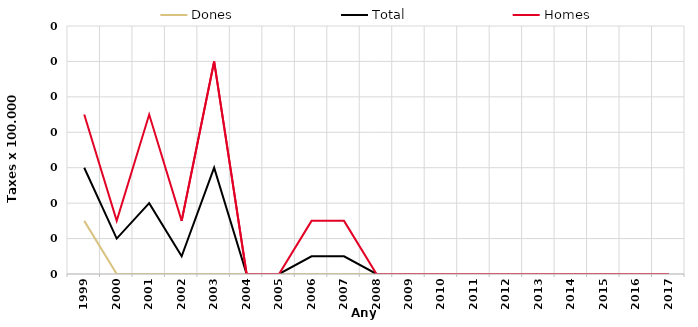
| Category | Dones | Total | Homes |
|---|---|---|---|
| 1999.0 | 0.03 | 0.06 | 0.09 |
| 2000.0 | 0 | 0.02 | 0.03 |
| 2001.0 | 0 | 0.04 | 0.09 |
| 2002.0 | 0 | 0.01 | 0.03 |
| 2003.0 | 0 | 0.06 | 0.12 |
| 2004.0 | 0 | 0 | 0 |
| 2005.0 | 0 | 0 | 0 |
| 2006.0 | 0 | 0.01 | 0.03 |
| 2007.0 | 0 | 0.01 | 0.03 |
| 2008.0 | 0 | 0 | 0 |
| 2009.0 | 0 | 0 | 0 |
| 2010.0 | 0 | 0 | 0 |
| 2011.0 | 0 | 0 | 0 |
| 2012.0 | 0 | 0 | 0 |
| 2013.0 | 0 | 0 | 0 |
| 2014.0 | 0 | 0 | 0 |
| 2015.0 | 0 | 0 | 0 |
| 2016.0 | 0 | 0 | 0 |
| 2017.0 | 0 | 0 | 0 |